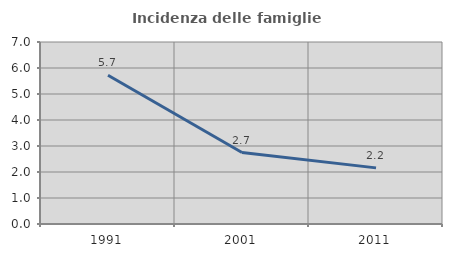
| Category | Incidenza delle famiglie numerose |
|---|---|
| 1991.0 | 5.722 |
| 2001.0 | 2.75 |
| 2011.0 | 2.159 |